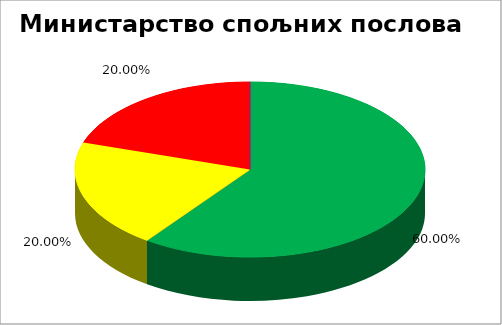
| Category | Министарство спољних послова  |
|---|---|
| 0 | 0.6 |
| 1 | 0 |
| 2 | 0.2 |
| 3 | 0.2 |
| 4 | 0 |